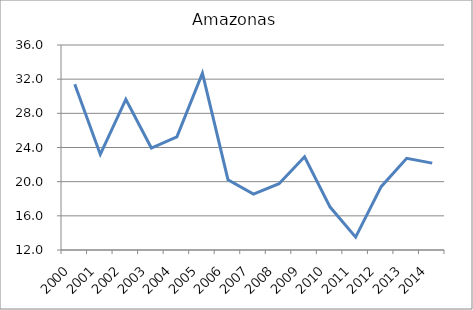
| Category | Amazonas |
|---|---|
| 2000.0 | 31.408 |
| 2001.0 | 23.188 |
| 2002.0 | 29.638 |
| 2003.0 | 23.939 |
| 2004.0 | 25.256 |
| 2005.0 | 32.704 |
| 2006.0 | 20.229 |
| 2007.0 | 18.548 |
| 2008.0 | 19.761 |
| 2009.0 | 22.922 |
| 2010.0 | 17.026 |
| 2011.0 | 13.502 |
| 2012.0 | 19.412 |
| 2013.0 | 22.728 |
| 2014.0 | 22.169 |